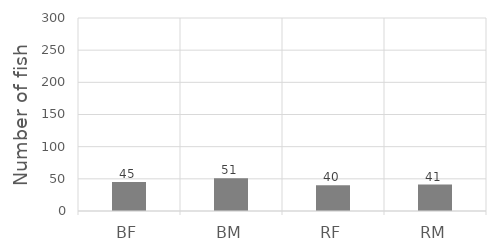
| Category | Series 0 |
|---|---|
| BF | 45 |
| BM | 51 |
| RF | 40 |
| RM | 41 |